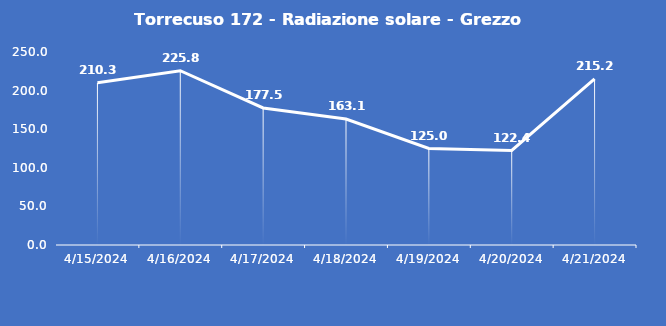
| Category | Torrecuso 172 - Radiazione solare - Grezzo (W/m2) |
|---|---|
| 4/15/24 | 210.3 |
| 4/16/24 | 225.8 |
| 4/17/24 | 177.5 |
| 4/18/24 | 163.1 |
| 4/19/24 | 125 |
| 4/20/24 | 122.4 |
| 4/21/24 | 215.2 |